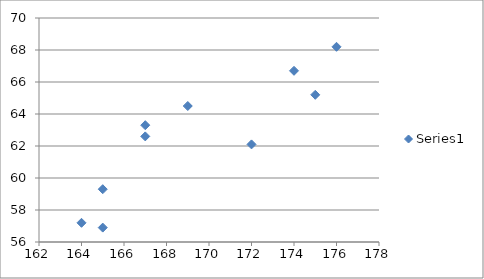
| Category | Series 0 |
|---|---|
| 164.0 | 57.2 |
| 165.0 | 56.9 |
| 165.0 | 59.3 |
| 167.0 | 63.3 |
| 167.0 | 62.6 |
| 169.0 | 64.5 |
| 172.0 | 62.1 |
| 174.0 | 66.7 |
| 175.0 | 65.2 |
| 176.0 | 68.2 |